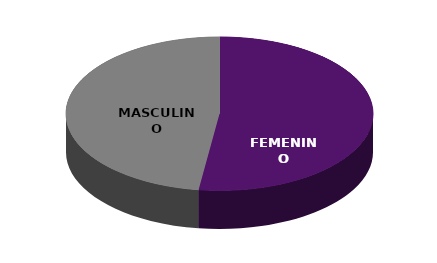
| Category | Series 0 |
|---|---|
| FEMENINO | 12 |
| MASCULINO | 11 |